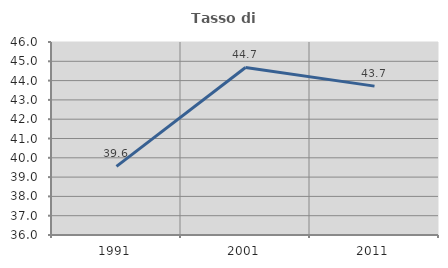
| Category | Tasso di occupazione   |
|---|---|
| 1991.0 | 39.558 |
| 2001.0 | 44.681 |
| 2011.0 | 43.713 |